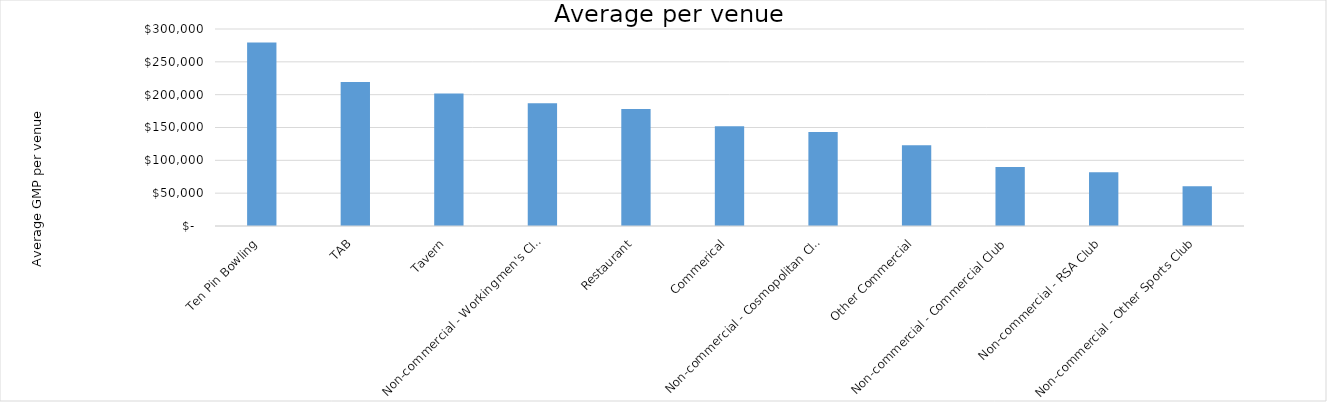
| Category | Average per venue |
|---|---|
| Ten Pin Bowling | 279408.748 |
| TAB | 219266.907 |
| Tavern | 201813.195 |
| Non-commercial - Workingmen's Club | 187071.176 |
| Restaurant | 178085.375 |
| Commerical | 152065.444 |
| Non-commercial - Cosmopolitan Club | 143157.242 |
| Other Commercial | 122952.197 |
| Non-commercial - Commercial Club | 89938.332 |
| Non-commercial - RSA Club | 81782.918 |
| Non-commercial - Other Sports Club | 60652.088 |